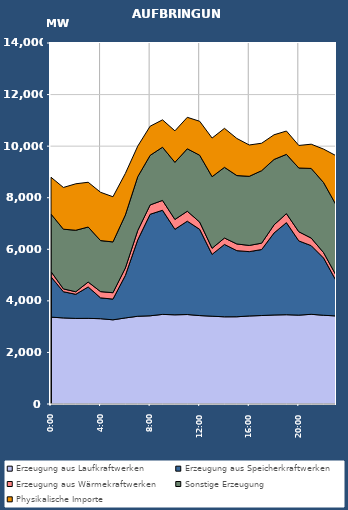
| Category | Erzeugung aus Laufkraftwerken | Erzeugung aus Speicherkraftwerken | Erzeugung aus Wärmekraftwerken | Sonstige Erzeugung | Physikalische Importe |
|---|---|---|---|---|---|
| 2007-01-17 | 3368.791 | 1565.098 | 201.87 | 2231.309 | 1426.528 |
| 2007-01-17 01:00:00 | 3338.444 | 1015.317 | 110.874 | 2314.373 | 1618.388 |
| 2007-01-17 02:00:00 | 3318.918 | 935.83 | 98.416 | 2385.029 | 1801.768 |
| 2007-01-17 03:00:00 | 3321.343 | 1217.921 | 190.267 | 2133.99 | 1735.888 |
| 2007-01-17 04:00:00 | 3308.314 | 808.547 | 241.535 | 1979.159 | 1872.708 |
| 2007-01-17 05:00:00 | 3264.692 | 803.121 | 247.904 | 1969.496 | 1751.764 |
| 2007-01-17 06:00:00 | 3338.139 | 1648.721 | 286.654 | 2056.129 | 1612.264 |
| 2007-01-17 07:00:00 | 3403 | 2962.595 | 361.759 | 2087.516 | 1185.468 |
| 2007-01-17 08:00:00 | 3421.118 | 3937.177 | 362.545 | 1921.848 | 1130.493 |
| 2007-01-17 09:00:00 | 3474.555 | 4038.881 | 382.637 | 2061.985 | 1061.832 |
| 2007-01-17 10:00:00 | 3459.138 | 3316.822 | 381.304 | 2215.29 | 1220.531 |
| 2007-01-17 11:00:00 | 3470.179 | 3619.532 | 386.472 | 2421.92 | 1220.049 |
| 2007-01-17 12:00:00 | 3429.442 | 3343.534 | 281.099 | 2593.226 | 1316.544 |
| 2007-01-17 13:00:00 | 3405.036 | 2397.511 | 236.407 | 2775.887 | 1498.671 |
| 2007-01-17 14:00:00 | 3381.723 | 2805.741 | 249.38 | 2741.552 | 1511.822 |
| 2007-01-17 15:00:00 | 3383.389 | 2563.722 | 259.178 | 2652.766 | 1438.787 |
| 2007-01-17 16:00:00 | 3414.305 | 2494.593 | 240.378 | 2680.167 | 1215.252 |
| 2007-01-17 17:00:00 | 3431.416 | 2559.594 | 246.177 | 2811.843 | 1064.234 |
| 2007-01-17 18:00:00 | 3452.214 | 3180.154 | 314.04 | 2537.948 | 955.818 |
| 2007-01-17 19:00:00 | 3462.536 | 3571.802 | 349.093 | 2297.743 | 904.872 |
| 2007-01-17 20:00:00 | 3446.653 | 2878.672 | 354.332 | 2472.603 | 873.916 |
| 2007-01-17 21:00:00 | 3478.202 | 2663.709 | 293.219 | 2700.686 | 939.468 |
| 2007-01-17 22:00:00 | 3441.47 | 2219.446 | 209.435 | 2716.721 | 1297.608 |
| 2007-01-17 23:00:00 | 3415.327 | 1373.451 | 209.341 | 2729.311 | 1902.948 |